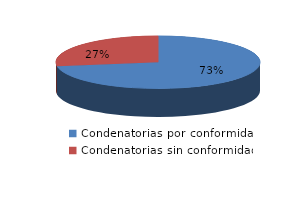
| Category | Series 0 |
|---|---|
| 0 | 53 |
| 1 | 20 |